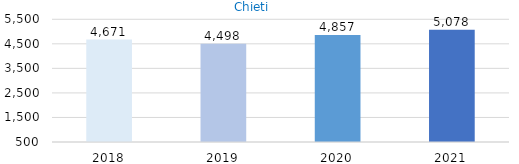
| Category | Chieti |
|---|---|
| 2018.0 | 4671 |
| 2019.0 | 4498 |
| 2020.0 | 4857 |
| 2021.0 | 5078 |